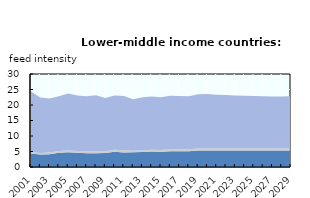
| Category | High protein feed | Medium protein feed | Low protein feed |
|---|---|---|---|
| 2001.0 | 4.316 | 0.521 | 19.479 |
| 2002.0 | 4.013 | 0.536 | 17.897 |
| 2003.0 | 4.138 | 0.528 | 17.399 |
| 2004.0 | 4.586 | 0.585 | 17.654 |
| 2005.0 | 4.735 | 0.577 | 18.405 |
| 2006.0 | 4.59 | 0.537 | 17.965 |
| 2007.0 | 4.472 | 0.572 | 17.807 |
| 2008.0 | 4.428 | 0.562 | 18.181 |
| 2009.0 | 4.51 | 0.551 | 17.229 |
| 2010.0 | 4.881 | 0.678 | 17.484 |
| 2011.0 | 4.716 | 0.656 | 17.548 |
| 2012.0 | 4.739 | 0.5 | 16.636 |
| 2013.0 | 4.865 | 0.551 | 17.098 |
| 2014.0 | 4.968 | 0.581 | 17.223 |
| 2015.0 | 4.908 | 0.563 | 17.006 |
| 2016.0 | 5.069 | 0.656 | 17.267 |
| 2017.0 | 5.061 | 0.608 | 17.228 |
| 2018.0 | 5.104 | 0.615 | 17.089 |
| 2019.0 | 5.344 | 0.629 | 17.461 |
| 2020.0 | 5.351 | 0.629 | 17.541 |
| 2021.0 | 5.34 | 0.628 | 17.327 |
| 2022.0 | 5.34 | 0.628 | 17.22 |
| 2023.0 | 5.336 | 0.629 | 17.13 |
| 2024.0 | 5.332 | 0.629 | 17.051 |
| 2025.0 | 5.324 | 0.63 | 16.977 |
| 2026.0 | 5.318 | 0.631 | 16.901 |
| 2027.0 | 5.309 | 0.632 | 16.837 |
| 2028.0 | 5.315 | 0.634 | 16.826 |
| 2029.0 | 5.319 | 0.637 | 16.831 |